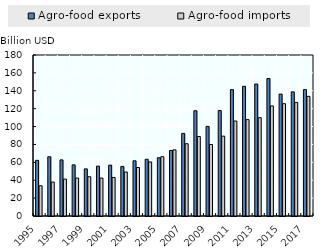
| Category | Agro-food exports | Agro-food imports |
|---|---|---|
| 1995.0 | 62.257 | 33.828 |
| 1996.0 | 66.23 | 37.936 |
| 1997.0 | 62.73 | 41.244 |
| 1998.0 | 57.175 | 42.426 |
| 1999.0 | 52.715 | 43.892 |
| 2000.0 | 55.767 | 42.44 |
| 2001.0 | 56.834 | 43.113 |
| 2002.0 | 55.433 | 49.187 |
| 2003.0 | 61.708 | 54.232 |
| 2004.0 | 63.408 | 60.457 |
| 2005.0 | 65.13 | 66.296 |
| 2006.0 | 73.2 | 73.945 |
| 2007.0 | 92.329 | 80.781 |
| 2008.0 | 117.658 | 88.882 |
| 2009.0 | 100.187 | 79.906 |
| 2010.0 | 117.959 | 89.27 |
| 2011.0 | 141.284 | 106.195 |
| 2012.0 | 145.009 | 107.77 |
| 2013.0 | 147.553 | 109.918 |
| 2014.0 | 153.69 | 123.103 |
| 2015.0 | 136.302 | 125.556 |
| 2016.0 | 138.794 | 126.997 |
| 2017.0 | 141.262 | 133.763 |